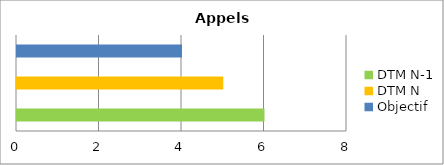
| Category | Series 0 |
|---|---|
| DTM N-1 | 6 |
| DTM N | 5 |
| Objectif | 4 |